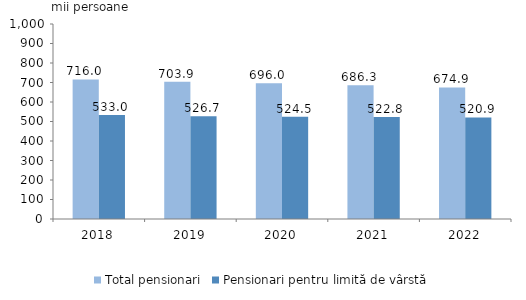
| Category | Total pensionari | Pensionari pentru limită de vârstă |
|---|---|---|
| 2018.0 | 716 | 533 |
| 2019.0 | 703.9 | 526.7 |
| 2020.0 | 696 | 524.5 |
| 2021.0 | 686.3 | 522.8 |
| 2022.0 | 674.9 | 520.9 |